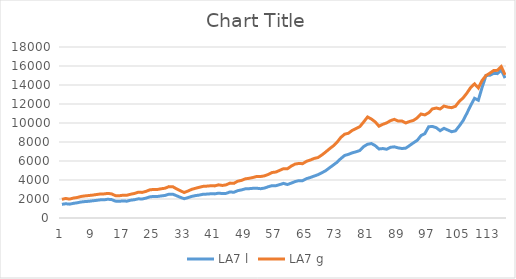
| Category | LA7 l | LA7 g |
|---|---|---|
| 0 | 1442.509 | 1964.081 |
| 1 | 1501.352 | 2055.754 |
| 2 | 1457.982 | 1990.792 |
| 3 | 1542.593 | 2097.806 |
| 4 | 1599.769 | 2158.643 |
| 5 | 1684.465 | 2267.191 |
| 6 | 1728.258 | 2324.692 |
| 7 | 1757.423 | 2364.266 |
| 8 | 1808.55 | 2407.548 |
| 9 | 1852.451 | 2468.126 |
| 10 | 1908.681 | 2523.334 |
| 11 | 1912.477 | 2534.808 |
| 12 | 1974.053 | 2589.976 |
| 13 | 1938.843 | 2538.686 |
| 14 | 1776.367 | 2354.214 |
| 15 | 1758.633 | 2339.103 |
| 16 | 1795.192 | 2401.595 |
| 17 | 1769.516 | 2396.782 |
| 18 | 1876.067 | 2501.79 |
| 19 | 1925.522 | 2584.596 |
| 20 | 2017.887 | 2713.863 |
| 21 | 2003.229 | 2694.483 |
| 22 | 2087.954 | 2801.78 |
| 23 | 2221.974 | 2961.854 |
| 24 | 2272.578 | 3005.445 |
| 25 | 2263.928 | 3002.141 |
| 26 | 2323.107 | 3079.19 |
| 27 | 2375.379 | 3133.67 |
| 28 | 2503.534 | 3302.641 |
| 29 | 2510.334 | 3298.367 |
| 30 | 2346.161 | 3068.808 |
| 31 | 2173.991 | 2866.222 |
| 32 | 2031.382 | 2682.603 |
| 33 | 2140.709 | 2839.844 |
| 34 | 2275.405 | 3021.016 |
| 35 | 2359.926 | 3132.32 |
| 36 | 2417.846 | 3235.711 |
| 37 | 2503.55 | 3333.935 |
| 38 | 2515.176 | 3356.083 |
| 39 | 2550.463 | 3396.285 |
| 40 | 2538.804 | 3379.697 |
| 41 | 2615.35 | 3490.135 |
| 42 | 2573.578 | 3426.079 |
| 43 | 2593.352 | 3493.069 |
| 44 | 2742.299 | 3673.684 |
| 45 | 2707.331 | 3646.265 |
| 46 | 2874.987 | 3871.48 |
| 47 | 2955.144 | 3959.2 |
| 48 | 3071.717 | 4122.779 |
| 49 | 3086.741 | 4178.71 |
| 50 | 3124.137 | 4263.859 |
| 51 | 3133.896 | 4371.846 |
| 52 | 3084.327 | 4366.982 |
| 53 | 3149.461 | 4434.361 |
| 54 | 3289.656 | 4584.096 |
| 55 | 3403.442 | 4787.823 |
| 56 | 3400.769 | 4837.171 |
| 57 | 3515.476 | 5012.398 |
| 58 | 3642.64 | 5193.389 |
| 59 | 3526.09 | 5173.523 |
| 60 | 3664 | 5457.247 |
| 61 | 3829.17 | 5671.633 |
| 62 | 3932.83 | 5739.073 |
| 63 | 3933.094 | 5718.061 |
| 64 | 4140.211 | 5962.944 |
| 65 | 4260.387 | 6096.157 |
| 66 | 4411.546 | 6266.513 |
| 67 | 4550.626 | 6359.388 |
| 68 | 4754.435 | 6621.053 |
| 69 | 4970.14 | 6934.165 |
| 70 | 5270.954 | 7270.432 |
| 71 | 5564.617 | 7582.198 |
| 72 | 5862.77 | 7967.226 |
| 73 | 6254.277 | 8480.381 |
| 74 | 6581.072 | 8822.576 |
| 75 | 6701.668 | 8920.309 |
| 76 | 6861.237 | 9224.047 |
| 77 | 6969.871 | 9417.369 |
| 78 | 7109.916 | 9626.974 |
| 79 | 7522.597 | 10118.557 |
| 80 | 7760.387 | 10635.829 |
| 81 | 7840.636 | 10417.457 |
| 82 | 7619.289 | 10117.972 |
| 83 | 7264.551 | 9658.523 |
| 84 | 7311.636 | 9861.896 |
| 85 | 7235.221 | 10011.509 |
| 86 | 7445.302 | 10243.398 |
| 87 | 7491.248 | 10384.227 |
| 88 | 7383 | 10207.552 |
| 89 | 7314.67 | 10213.58 |
| 90 | 7352.364 | 10002.761 |
| 91 | 7628.077 | 10161.56 |
| 92 | 7913.189 | 10269.356 |
| 93 | 8169.097 | 10536.132 |
| 94 | 8675.832 | 10945.963 |
| 95 | 8885.059 | 10849.09 |
| 96 | 9607.246 | 11079.845 |
| 97 | 9633.214 | 11488.628 |
| 98 | 9501.158 | 11575.358 |
| 99 | 9190.066 | 11474.877 |
| 100 | 9440.872 | 11785.545 |
| 101 | 9260.639 | 11671.694 |
| 102 | 9082.614 | 11613.544 |
| 103 | 9171.487 | 11756.316 |
| 104 | 9679.038 | 12269.294 |
| 105 | 10245.889 | 12635.663 |
| 106 | 11022.093 | 13142.752 |
| 107 | 11851.85 | 13740.144 |
| 108 | 12597.117 | 14119.215 |
| 109 | 12397.859 | 13690.657 |
| 110 | 13773.31 | 14484.695 |
| 111 | 14999.109 | 14999.109 |
| 112 | 15025.931 | 15239.561 |
| 113 | 15224.807 | 15523.194 |
| 114 | 15196.398 | 15543.816 |
| 115 | 15580.377 | 15937.553 |
| 116 | 14729.576 | 15062.521 |